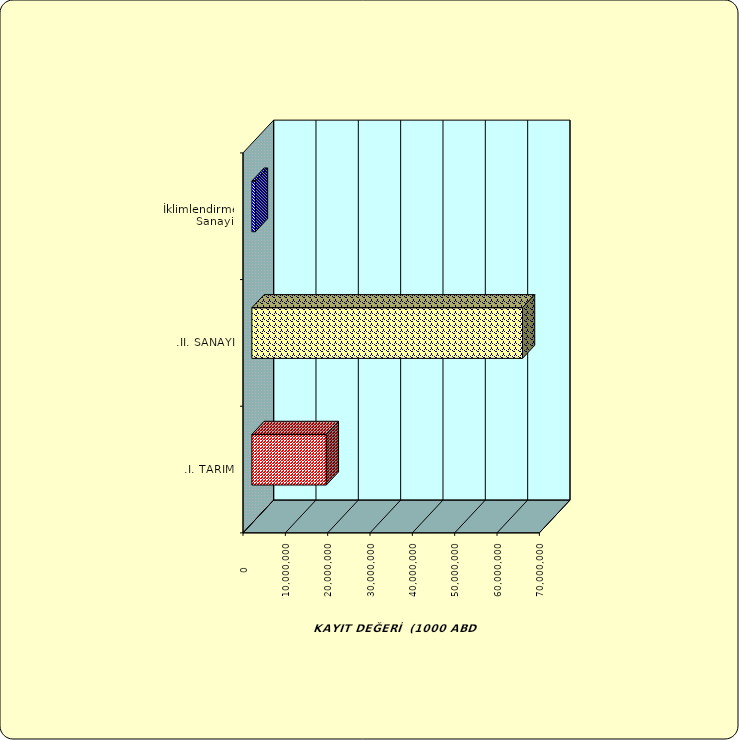
| Category | Series 0 |
|---|---|
| .I. TARIM | 17575601.426 |
| .II. SANAYİ | 63918820.441 |
|  İklimlendirme Sanayii | 832122.038 |